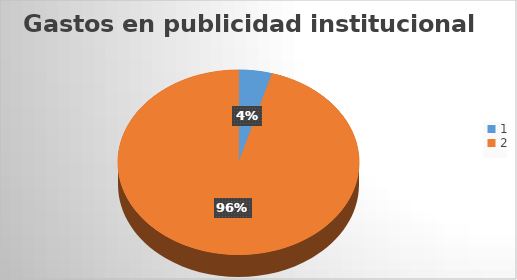
| Category | Series 0 |
|---|---|
| 0 | 255488.35 |
| 1 | 5467024.73 |